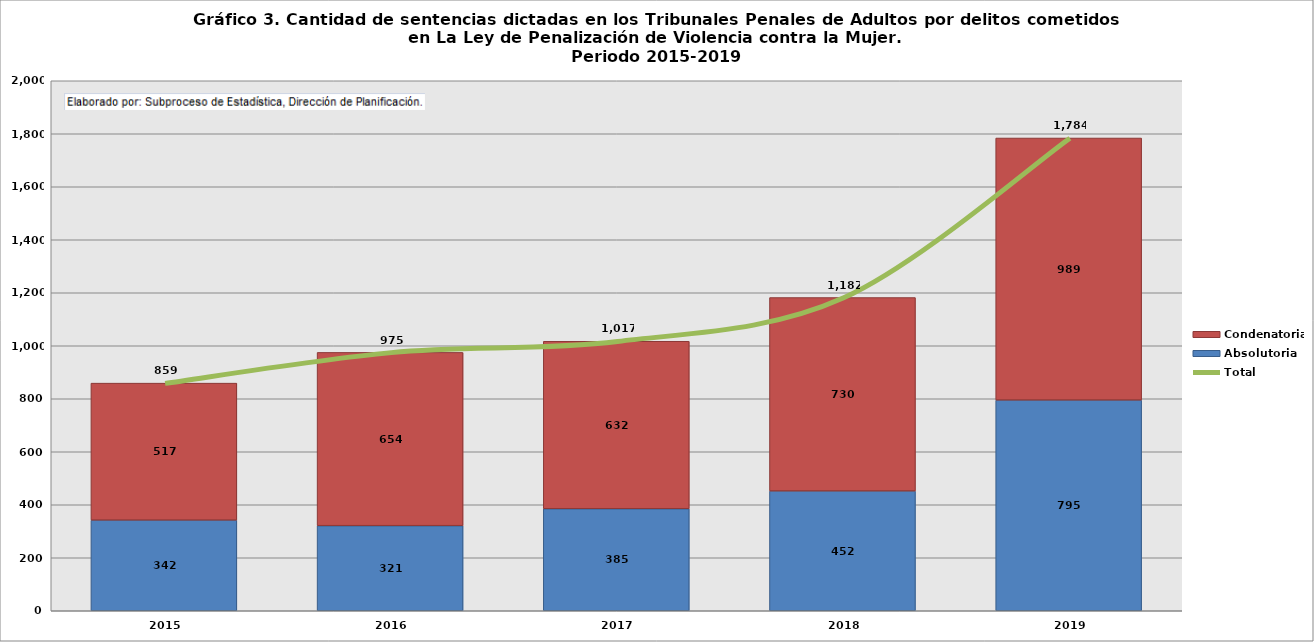
| Category | Absolutoria | Condenatoria |
|---|---|---|
| 2015.0 | 342 | 517 |
| 2016.0 | 321 | 654 |
| 2017.0 | 385 | 632 |
| 2018.0 | 452 | 730 |
| 2019.0 | 795 | 989 |